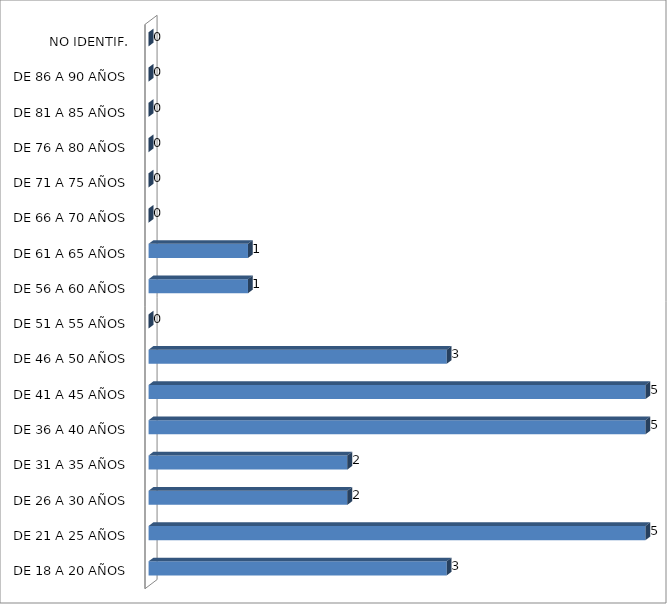
| Category | ESTADO  DE EBRIEDAD |
|---|---|
| DE 18 A 20 AÑOS | 3 |
| DE 21 A 25 AÑOS | 5 |
| DE 26 A 30 AÑOS | 2 |
| DE 31 A 35 AÑOS | 2 |
| DE 36 A 40 AÑOS | 5 |
| DE 41 A 45 AÑOS | 5 |
| DE 46 A 50 AÑOS | 3 |
| DE 51 A 55 AÑOS | 0 |
| DE 56 A 60 AÑOS | 1 |
| DE 61 A 65 AÑOS | 1 |
| DE 66 A 70 AÑOS | 0 |
| DE 71 A 75 AÑOS | 0 |
| DE 76 A 80 AÑOS | 0 |
| DE 81 A 85 AÑOS | 0 |
| DE 86 A 90 AÑOS | 0 |
| NO IDENTIF. | 0 |